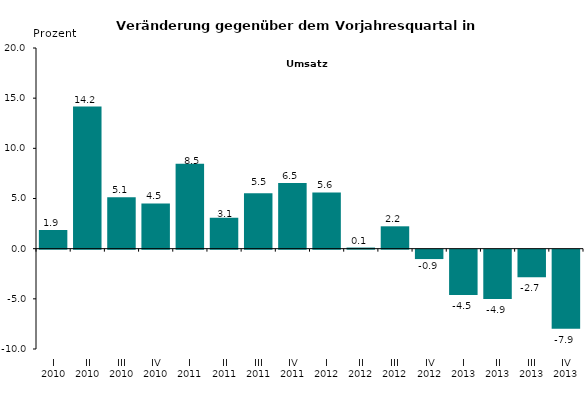
| Category | Series 0 |
|---|---|
| I 2010 | 1.858 |
| II 2010 | 14.167 |
| III 2010 | 5.127 |
| IV 2010 | 4.511 |
| I 2011 | 8.452 |
| II 2011 | 3.069 |
| III 2011 | 5.528 |
| IV 2011 | 6.549 |
| I 2012 | 5.603 |
| II 2012 | 0.11 |
| III 2012 | 2.228 |
| IV 2012 | -0.936 |
| I 2013 | -4.513 |
| II 2013 | -4.922 |
| III 2013 | -2.749 |
| IV 2013 | -7.876 |